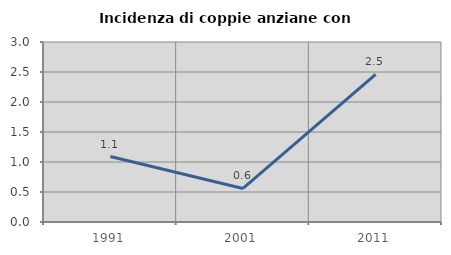
| Category | Incidenza di coppie anziane con figli |
|---|---|
| 1991.0 | 1.091 |
| 2001.0 | 0.559 |
| 2011.0 | 2.459 |